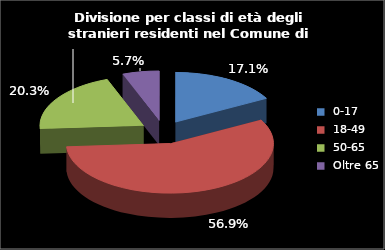
| Category | Series 0 | Series 1 |
|---|---|---|
| 0-17 | 334 |  |
| 18-49 | 1114 |  |
| 50-65 | 398 |  |
| Oltre 65 | 112 |  |